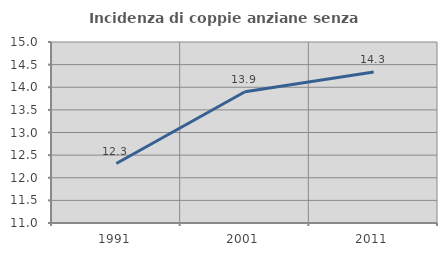
| Category | Incidenza di coppie anziane senza figli  |
|---|---|
| 1991.0 | 12.314 |
| 2001.0 | 13.902 |
| 2011.0 | 14.338 |